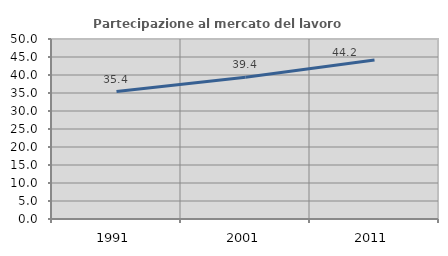
| Category | Partecipazione al mercato del lavoro  femminile |
|---|---|
| 1991.0 | 35.388 |
| 2001.0 | 39.39 |
| 2011.0 | 44.176 |